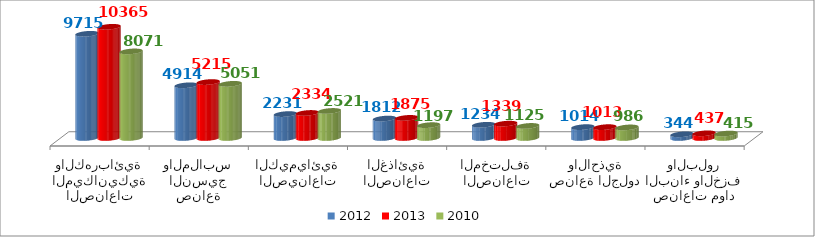
| Category | 2012 | 2013 | 2010 |
|---|---|---|---|
| الصناعات الميكانيكية والكهربائية | 9714.8 | 10364.6 | 8070.9 |
| صناعة النسيج والملابس | 4913.5 | 5214.59 | 5050.5 |
| الصيناعات الكيميائية | 2231.165 | 2333.968 | 2521.3 |
| الصناعات الغذائية | 1811.783 | 1875.307 | 1196.9 |
| الصناعات المختلفة | 1233.541 | 1338.857 | 1125.3 |
| صناعة الجلود والاحذية | 1014.3 | 1012.56 | 985.9 |
| صناعات مواد البناء والخزف والبلور | 343.584 | 436.766 | 415.1 |